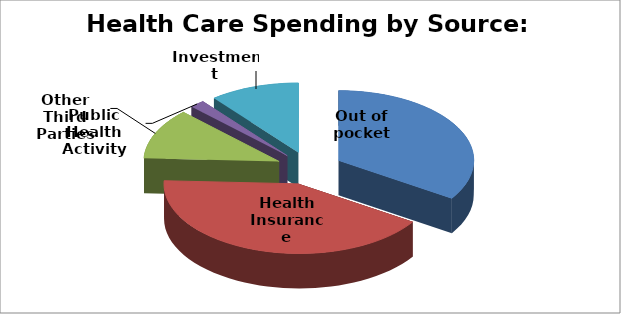
| Category | 1969 |
|---|---|
| Out of pocket | 22616.6 |
| Health Insurance | 27488.3 |
| Other Third Parties | 7788.3 |
| Public Health Activity | 1173.8 |
| Investment | 7105.1 |